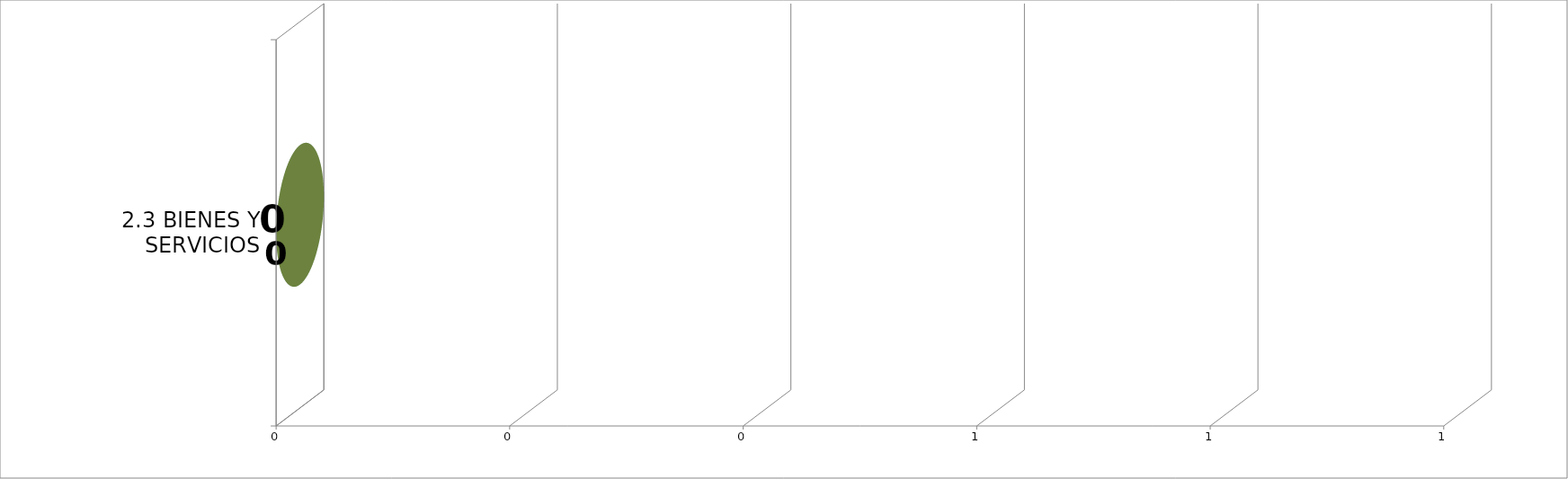
| Category | EJECUTADO | SALDO  |
|---|---|---|
| 2.3 BIENES Y SERVICIOS | 0 | 0 |